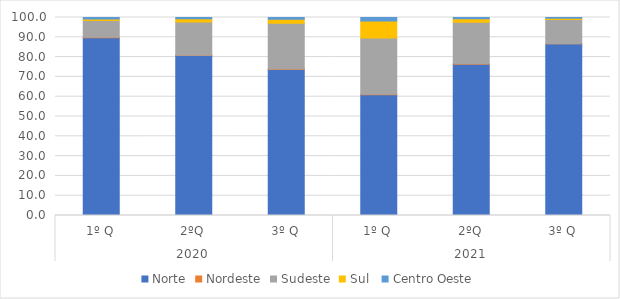
| Category | Norte | Nordeste | Sudeste | Sul  | Centro Oeste |
|---|---|---|---|---|---|
| 0 | 89.758 | 0.208 | 8.463 | 0.868 | 0.703 |
| 1 | 80.844 | 0.106 | 16.834 | 1.583 | 0.633 |
| 2 | 73.725 | 0.253 | 23.117 | 1.974 | 0.932 |
| 3 | 61.038 | 0.211 | 28.425 | 8.562 | 1.765 |
| 4 | 76.429 | 0.157 | 21.06 | 1.753 | 0.602 |
| 5 | 86.703 | 0.068 | 12.216 | 0.679 | 0.334 |